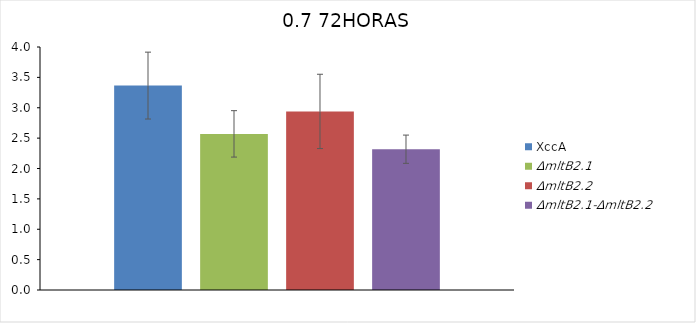
| Category | XccA  | ΔmltB2.1 | ΔmltB2.2 | ΔmltB2.1-ΔmltB2.2 |
|---|---|---|---|---|
| 0 | 3.365 | 2.57 | 2.94 | 2.318 |